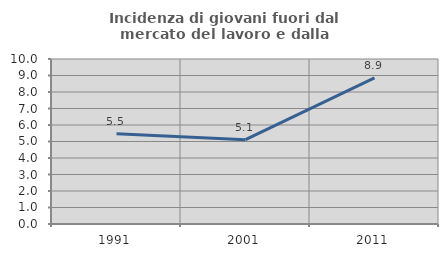
| Category | Incidenza di giovani fuori dal mercato del lavoro e dalla formazione  |
|---|---|
| 1991.0 | 5.473 |
| 2001.0 | 5.109 |
| 2011.0 | 8.854 |